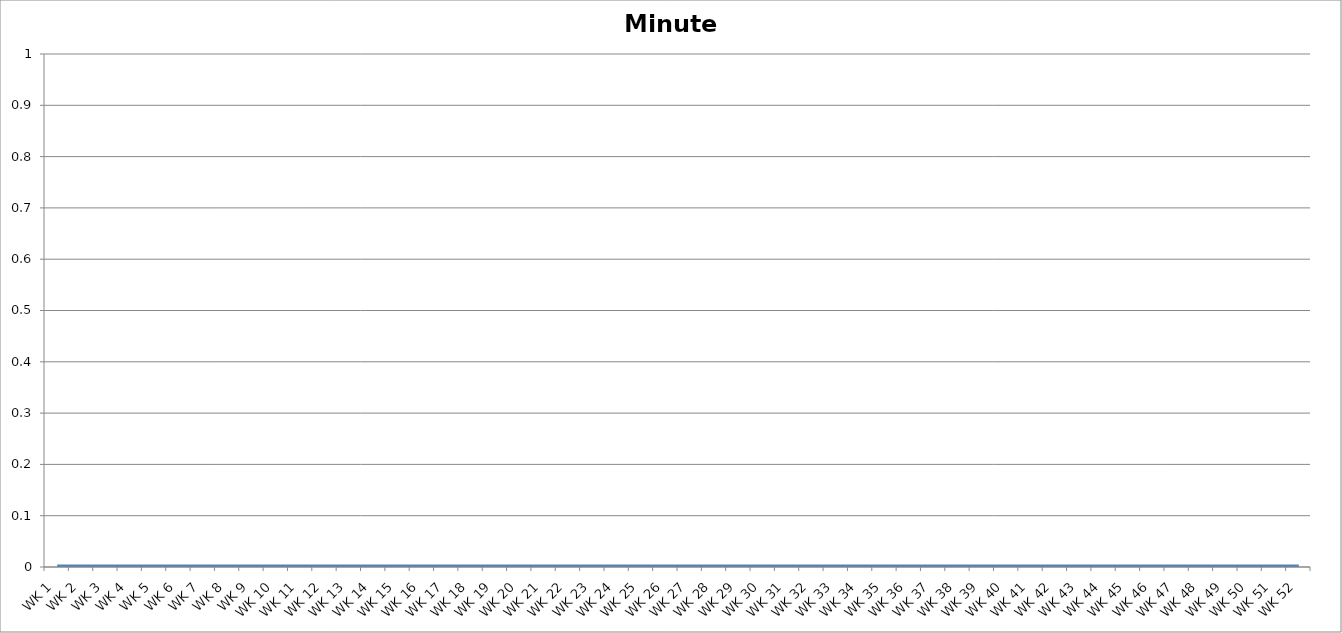
| Category | Minuten |
|---|---|
| WK 1 | 0 |
| WK 2 | 0 |
| WK 3 | 0 |
| WK 4 | 0 |
| WK 5 | 0 |
| WK 6 | 0 |
| WK 7 | 0 |
| WK 8 | 0 |
| WK 9 | 0 |
| WK 10 | 0 |
| WK 11 | 0 |
| WK 12 | 0 |
| WK 13 | 0 |
| WK 14 | 0 |
| WK 15 | 0 |
| WK 16 | 0 |
| WK 17 | 0 |
| WK 18 | 0 |
| WK 19 | 0 |
| WK 20 | 0 |
| WK 21 | 0 |
| WK 22 | 0 |
| WK 23 | 0 |
| WK 24 | 0 |
| WK 25 | 0 |
| WK 26 | 0 |
| WK 27 | 0 |
| WK 28 | 0 |
| WK 29 | 0 |
| WK 30 | 0 |
| WK 31 | 0 |
| WK 32 | 0 |
| WK 33 | 0 |
| WK 34 | 0 |
| WK 35 | 0 |
| WK 36 | 0 |
| WK 37 | 0 |
| WK 38 | 0 |
| WK 39 | 0 |
| WK 40 | 0 |
| WK 41 | 0 |
| WK 42 | 0 |
| WK 43 | 0 |
| WK 44 | 0 |
| WK 45 | 0 |
| WK 46 | 0 |
| WK 47 | 0 |
| WK 48 | 0 |
| WK 49 | 0 |
| WK 50 | 0 |
| WK 51 | 0 |
| WK 52 | 0 |